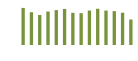
| Category | Saldo [ (1)-(2) ] |
|---|---|
| 0 | 329612.931 |
| 1 | 291358.085 |
| 2 | 266512.131 |
| 3 | 297562.723 |
| 4 | 310243.352 |
| 5 | 320714.531 |
| 6 | 286229.119 |
| 7 | 282809.198 |
| 8 | 306315.684 |
| 9 | 322195.815 |
| 10 | 306185.726 |
| 11 | 300797.708 |
| 12 | 287185.489 |
| 13 | 226672.174 |